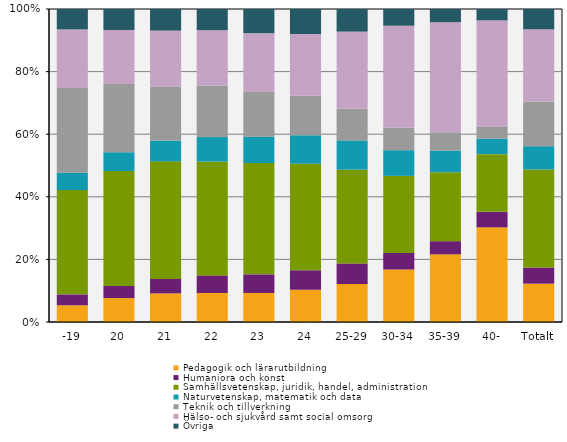
| Category | Pedagogik och lärarutbildning | Humaniora och konst | Samhällsvetenskap, juridik, handel, administration | Naturvetenskap, matematik och data | Teknik och tillverkning | Hälso- och sjukvård samt social omsorg | Övriga |
|---|---|---|---|---|---|---|---|
| -19 | 5.338 | 3.496 | 33.349 | 5.563 | 27.053 | 18.756 | 6.532 |
| 20 | 7.648 | 3.909 | 36.74 | 6.022 | 21.8 | 17.311 | 6.706 |
| 21 | 9.159 | 4.614 | 37.654 | 6.674 | 17.3 | 17.875 | 6.93 |
| 22 | 9.289 | 5.647 | 36.448 | 7.884 | 16.431 | 17.808 | 6.807 |
| 23 | 9.307 | 5.971 | 35.693 | 8.428 | 14.345 | 18.829 | 7.758 |
| 24 | 10.362 | 6.23 | 34.13 | 9.167 | 12.671 | 19.839 | 7.982 |
| 25-29 | 12.157 | 6.616 | 30.036 | 9.394 | 10.1 | 24.747 | 7.261 |
| 30-34 | 16.807 | 5.314 | 24.686 | 8.231 | 7.241 | 32.624 | 5.359 |
| 35-39 | 21.653 | 4.225 | 22.053 | 6.926 | 5.856 | 35.224 | 4.236 |
| 40- | 30.295 | 4.976 | 18.465 | 4.897 | 3.973 | 33.952 | 3.633 |
| Totalt | 12.266 | 5.186 | 31.383 | 7.46 | 14.318 | 23.125 | 6.5 |